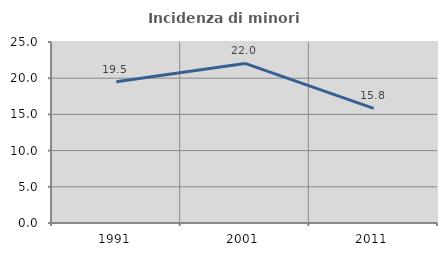
| Category | Incidenza di minori stranieri |
|---|---|
| 1991.0 | 19.512 |
| 2001.0 | 22.043 |
| 2011.0 | 15.839 |